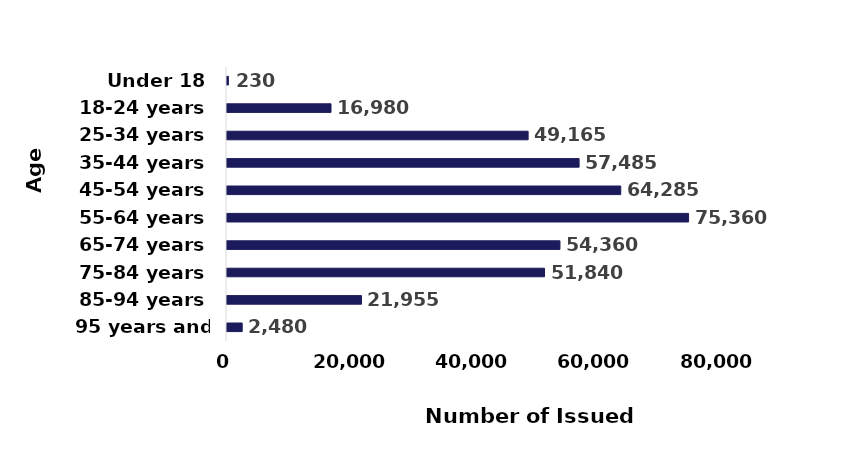
| Category | Number of issued payments |
|---|---|
| Under 18 | 230 |
| 18-24 years | 16980 |
| 25-34 years | 49165 |
| 35-44 years | 57485 |
| 45-54 years | 64285 |
| 55-64 years | 75360 |
| 65-74 years | 54360 |
| 75-84 years | 51840 |
| 85-94 years | 21955 |
| 95 years and older | 2480 |